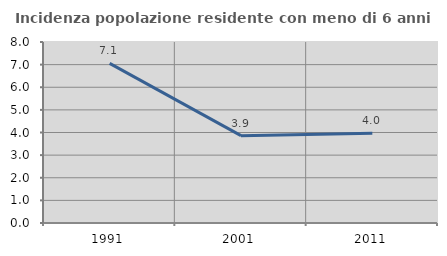
| Category | Incidenza popolazione residente con meno di 6 anni |
|---|---|
| 1991.0 | 7.055 |
| 2001.0 | 3.861 |
| 2011.0 | 3.962 |